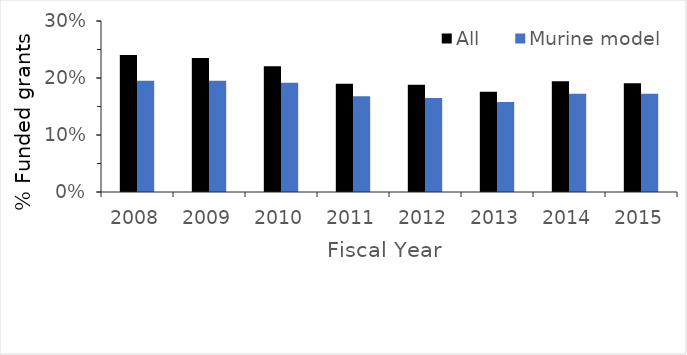
| Category | All  | Murine model |
|---|---|---|
| 2008.0 | 0.24 | 0.195 |
| 2009.0 | 0.235 | 0.195 |
| 2010.0 | 0.221 | 0.192 |
| 2011.0 | 0.19 | 0.168 |
| 2012.0 | 0.188 | 0.165 |
| 2013.0 | 0.176 | 0.158 |
| 2014.0 | 0.194 | 0.172 |
| 2015.0 | 0.191 | 0.172 |